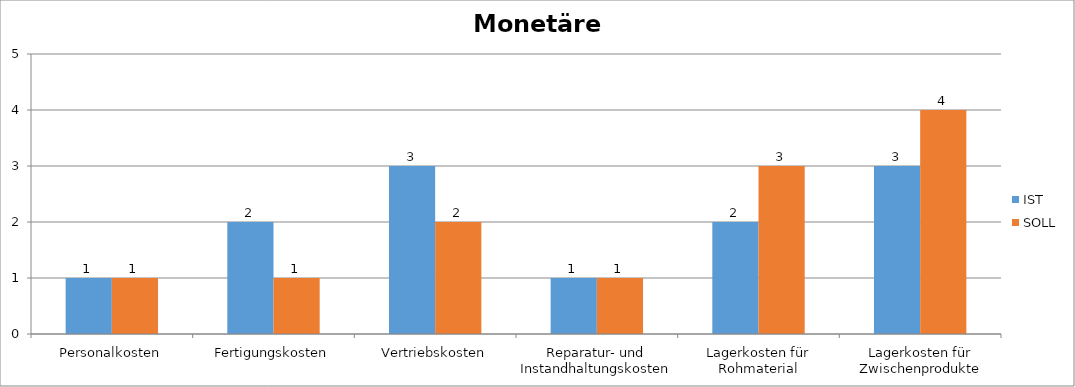
| Category | IST | SOLL |
|---|---|---|
| Personalkosten | 1 | 1 |
| Fertigungskosten | 2 | 1 |
| Vertriebskosten | 3 | 2 |
| Reparatur- und Instandhaltungskosten | 1 | 1 |
| Lagerkosten für Rohmaterial | 2 | 3 |
| Lagerkosten für Zwischenprodukte | 3 | 4 |